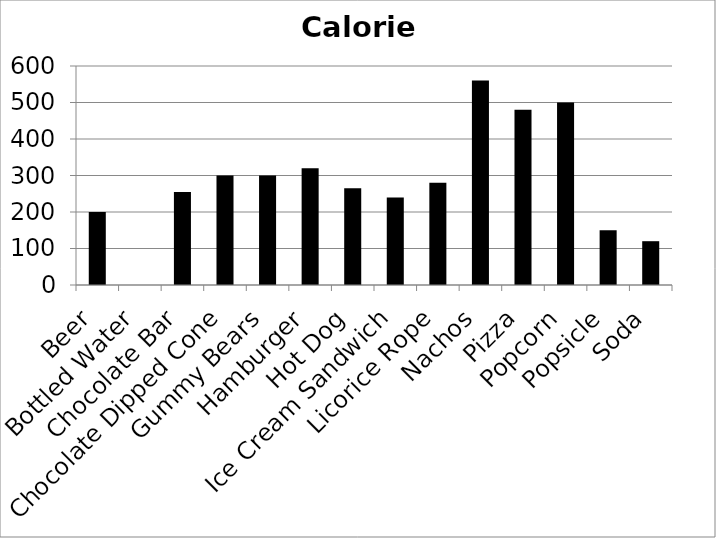
| Category | Calories |
|---|---|
| Beer | 200 |
| Bottled Water | 0 |
| Chocolate Bar | 255 |
| Chocolate Dipped Cone | 300 |
| Gummy Bears | 300 |
| Hamburger | 320 |
| Hot Dog | 265 |
| Ice Cream Sandwich | 240 |
| Licorice Rope | 280 |
| Nachos | 560 |
| Pizza | 480 |
| Popcorn | 500 |
| Popsicle | 150 |
| Soda | 120 |